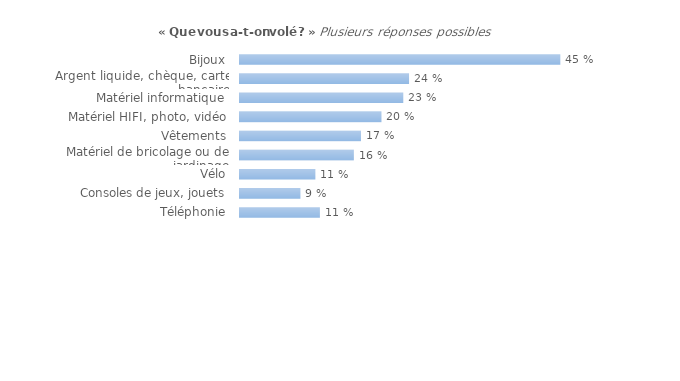
| Category | Series 0 |
|---|---|
| Bijoux | 0.451 |
| Argent liquide, chèque, carte bancaire | 0.238 |
| Matériel informatique | 0.23 |
| Matériel HIFI, photo, vidéo | 0.199 |
| Vêtements | 0.17 |
| Matériel de bricolage ou de jardinage | 0.16 |
| Vélo | 0.106 |
| Consoles de jeux, jouets | 0.085 |
| Téléphonie | 0.113 |